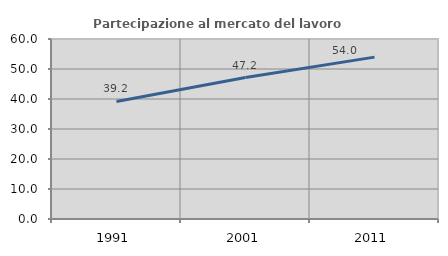
| Category | Partecipazione al mercato del lavoro  femminile |
|---|---|
| 1991.0 | 39.187 |
| 2001.0 | 47.154 |
| 2011.0 | 53.957 |